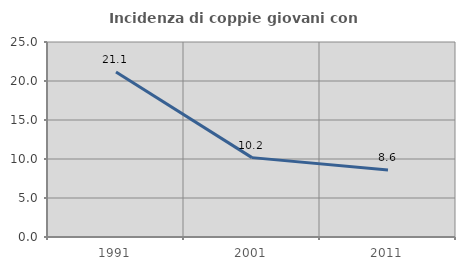
| Category | Incidenza di coppie giovani con figli |
|---|---|
| 1991.0 | 21.145 |
| 2001.0 | 10.177 |
| 2011.0 | 8.597 |